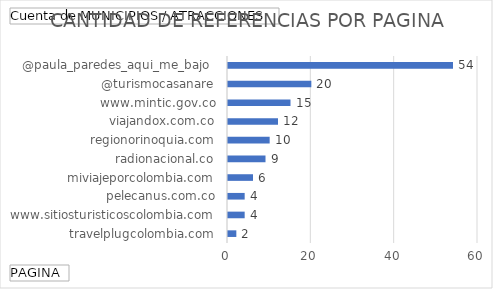
| Category | Total |
|---|---|
| travelplugcolombia.com | 2 |
| www.sitiosturisticoscolombia.com | 4 |
| pelecanus.com.co | 4 |
| miviajeporcolombia.com | 6 |
| radionacional.co | 9 |
| regionorinoquia.com | 10 |
| viajandox.com.co | 12 |
| www.mintic.gov.co | 15 |
| @turismocasanare | 20 |
| @paula_paredes_aqui_me_bajo  | 54 |